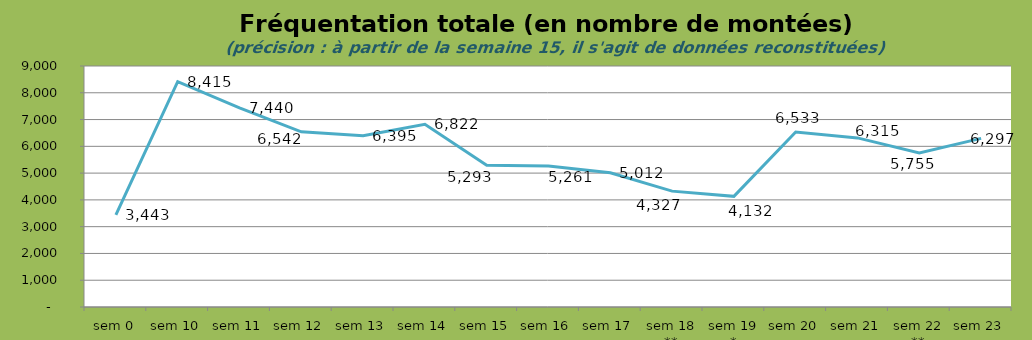
| Category |  3 443     8 415     7 440     6 542     6 395     6 822     5 293     5 261     5 012     4 327     4 132     6 533     6 315     5 755     6 297    |
|---|---|
| sem 0 | 3443 |
| sem 10 | 8415 |
| sem 11 | 7440 |
| sem 12 | 6541.5 |
| sem 13 | 6395 |
| sem 14 | 6821.5 |
| sem 15 | 5292.54 |
| sem 16 | 5261.216 |
| sem 17 | 5011.825 |
| sem 18 ** | 4326.649 |
| sem 19 * | 4132.333 |
| sem 20 | 6533.243 |
| sem 21 | 6315.317 |
| sem 22 ** | 5754.676 |
| sem 23 | 6296.587 |